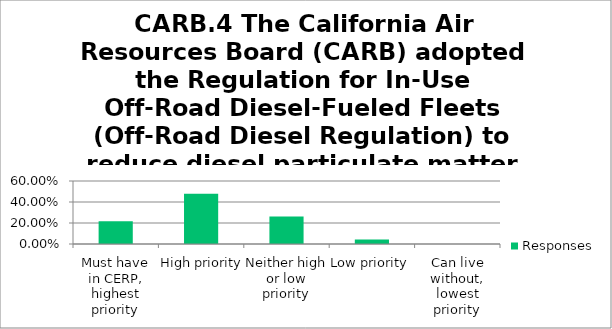
| Category | Responses |
|---|---|
| Must have in CERP, highest priority | 0.217 |
| High priority | 0.478 |
| Neither high or low priority | 0.261 |
| Low priority | 0.044 |
| Can live without, lowest priority | 0 |